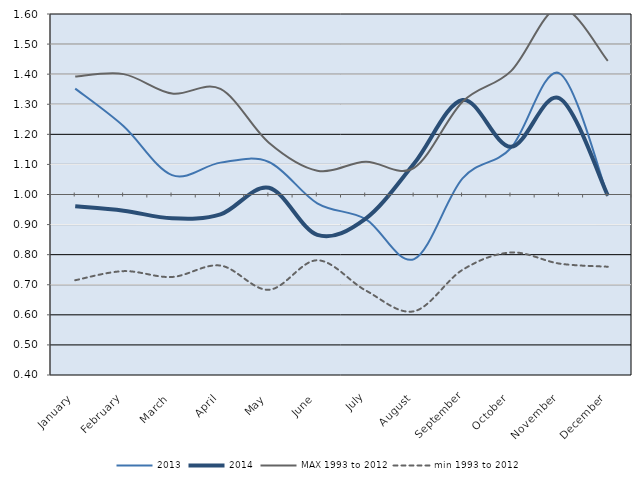
| Category | 2013 | 2014 | MAX 1993 to 2012 | min 1993 to 2012 |
|---|---|---|---|---|
| January | 1.352 | 0.961 | 1.392 | 0.715 |
| February | 1.227 | 0.946 | 1.4 | 0.745 |
| March | 1.064 | 0.921 | 1.336 | 0.726 |
| April | 1.106 | 0.934 | 1.351 | 0.764 |
| May | 1.108 | 1.022 | 1.172 | 0.683 |
| June | 0.971 | 0.866 | 1.079 | 0.781 |
| July | 0.918 | 0.92 | 1.109 | 0.681 |
| August | 0.785 | 1.103 | 1.089 | 0.612 |
| September | 1.054 | 1.314 | 1.308 | 0.75 |
| October | 1.155 | 1.158 | 1.41 | 0.807 |
| November | 1.403 | 1.32 | 1.622 | 0.77 |
| December | 0.996 | 0.997 | 1.444 | 0.76 |